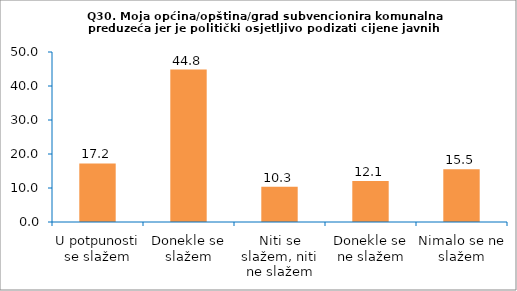
| Category | Series 0 |
|---|---|
| U potpunosti se slažem | 17.241 |
| Donekle se slažem | 44.828 |
| Niti se slažem, niti ne slažem | 10.345 |
| Donekle se ne slažem | 12.069 |
| Nimalo se ne slažem | 15.517 |